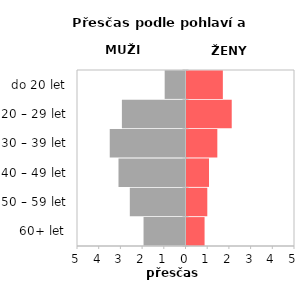
| Category | Přesčas |
|---|---|
| 60+ let | 0.833 |
| 50 – 59 let | 0.958 |
| 40 – 49 let | 1.037 |
| 30 – 39 let | 1.42 |
| 20 – 29 let | 2.084 |
| do 20 let | 1.675 |